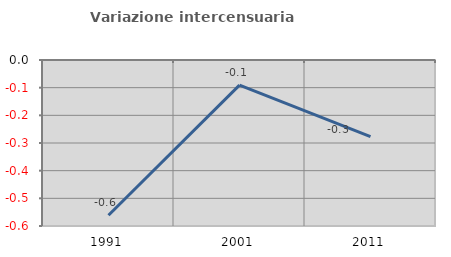
| Category | Variazione intercensuaria annua |
|---|---|
| 1991.0 | -0.561 |
| 2001.0 | -0.091 |
| 2011.0 | -0.277 |